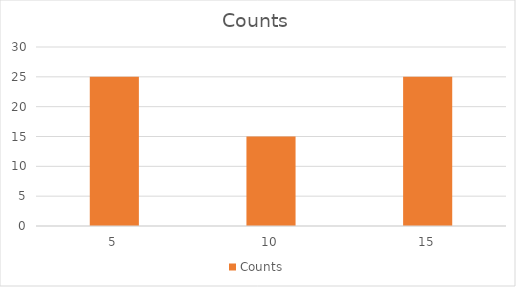
| Category | Counts |
|---|---|
| 5.0 | 25 |
| 10.0 | 15 |
| 15.0 | 25 |